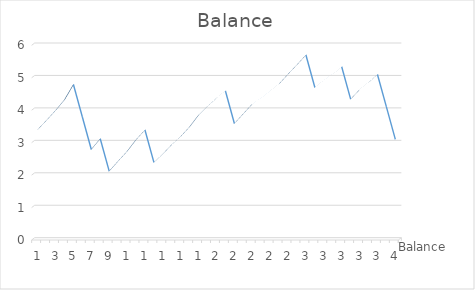
| Category | Balance |
|---|---|
| 0 | 3.34 |
| 1 | 3.63 |
| 2 | 3.93 |
| 3 | 4.26 |
| 4 | 4.73 |
| 5 | 3.73 |
| 6 | 2.73 |
| 7 | 3.06 |
| 8 | 2.06 |
| 9 | 2.37 |
| 10 | 2.67 |
| 11 | 3.03 |
| 12 | 3.33 |
| 13 | 2.33 |
| 14 | 2.59 |
| 15 | 2.88 |
| 16 | 3.13 |
| 17 | 3.43 |
| 18 | 3.79 |
| 19 | 4.06 |
| 20 | 4.31 |
| 21 | 4.53 |
| 22 | 3.53 |
| 23 | 3.83 |
| 24 | 4.13 |
| 25 | 4.33 |
| 26 | 4.53 |
| 27 | 4.75 |
| 28 | 5.05 |
| 29 | 5.34 |
| 30 | 5.64 |
| 31 | 4.64 |
| 32 | 4.86 |
| 33 | 5.06 |
| 34 | 5.28 |
| 35 | 4.28 |
| 36 | 4.57 |
| 37 | 4.79 |
| 38 | 5.04 |
| 39 | 4.04 |
| 40 | 3.04 |